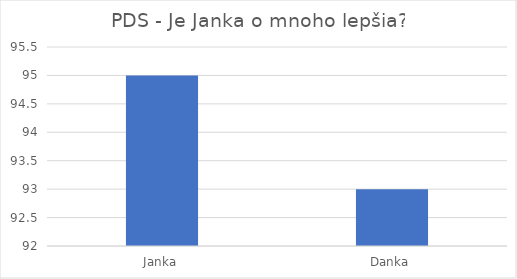
| Category | PDS |
|---|---|
| Janka | 95 |
| Danka | 93 |